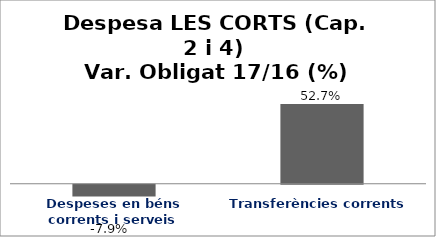
| Category | Series 0 |
|---|---|
| Despeses en béns corrents i serveis | -0.079 |
| Transferències corrents | 0.527 |